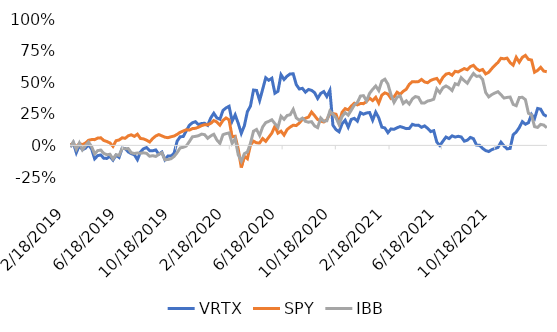
| Category | VRTX | SPY | IBB |
|---|---|---|---|
| 2/18/19 | -0.012 | 0.006 | -0.012 |
| 2/25/19 | 0.022 | 0.011 | 0.027 |
| 3/4/19 | -0.057 | -0.01 | -0.031 |
| 3/11/19 | 0 | 0.014 | 0.019 |
| 3/18/19 | -0.035 | 0.007 | -0.035 |
| 3/25/19 | -0.022 | 0.018 | -0.002 |
| 4/1/19 | 0.004 | 0.04 | 0.026 |
| 4/8/19 | -0.028 | 0.046 | -0.009 |
| 4/15/19 | -0.106 | 0.046 | -0.067 |
| 4/22/19 | -0.081 | 0.058 | -0.041 |
| 4/29/19 | -0.076 | 0.06 | -0.037 |
| 5/6/19 | -0.102 | 0.039 | -0.063 |
| 5/13/19 | -0.103 | 0.031 | -0.074 |
| 5/20/19 | -0.087 | 0.02 | -0.07 |
| 5/27/19 | -0.116 | -0.008 | -0.108 |
| 6/3/19 | -0.077 | 0.037 | -0.073 |
| 6/10/19 | -0.095 | 0.043 | -0.08 |
| 6/17/19 | -0.022 | 0.06 | -0.023 |
| 6/24/19 | -0.025 | 0.056 | -0.026 |
| 7/1/19 | -0.052 | 0.076 | -0.025 |
| 7/8/19 | -0.065 | 0.084 | -0.058 |
| 7/15/19 | -0.074 | 0.071 | -0.064 |
| 7/22/19 | -0.113 | 0.089 | -0.06 |
| 7/29/19 | -0.051 | 0.055 | -0.062 |
| 8/5/19 | -0.027 | 0.051 | -0.059 |
| 8/12/19 | -0.017 | 0.041 | -0.063 |
| 8/19/19 | -0.042 | 0.027 | -0.086 |
| 8/26/19 | -0.043 | 0.054 | -0.081 |
| 9/2/19 | -0.036 | 0.075 | -0.087 |
| 9/9/19 | -0.07 | 0.086 | -0.07 |
| 9/16/19 | -0.053 | 0.075 | -0.058 |
| 9/23/19 | -0.113 | 0.065 | -0.114 |
| 9/30/19 | -0.083 | 0.061 | -0.112 |
| 10/7/19 | -0.083 | 0.068 | -0.105 |
| 10/14/19 | -0.063 | 0.074 | -0.087 |
| 10/21/19 | 0.034 | 0.087 | -0.058 |
| 10/28/19 | 0.068 | 0.104 | -0.02 |
| 11/4/19 | 0.07 | 0.114 | -0.015 |
| 11/11/19 | 0.116 | 0.124 | -0.005 |
| 11/18/19 | 0.159 | 0.121 | 0.03 |
| 11/25/19 | 0.179 | 0.133 | 0.068 |
| 12/2/19 | 0.187 | 0.135 | 0.071 |
| 12/9/19 | 0.164 | 0.144 | 0.077 |
| 12/16/19 | 0.173 | 0.156 | 0.089 |
| 12/23/19 | 0.175 | 0.164 | 0.085 |
| 12/30/19 | 0.159 | 0.162 | 0.056 |
| 1/6/20 | 0.217 | 0.174 | 0.075 |
| 1/13/20 | 0.254 | 0.197 | 0.088 |
| 1/20/20 | 0.218 | 0.185 | 0.043 |
| 1/27/20 | 0.207 | 0.16 | 0.016 |
| 2/3/20 | 0.276 | 0.198 | 0.085 |
| 2/10/20 | 0.296 | 0.217 | 0.093 |
| 2/17/20 | 0.31 | 0.202 | 0.099 |
| 2/24/20 | 0.191 | 0.068 | 0.016 |
| 3/2/20 | 0.242 | 0.072 | 0.053 |
| 3/9/20 | 0.174 | -0.029 | -0.075 |
| 3/16/20 | 0.095 | -0.175 | -0.125 |
| 3/23/20 | 0.155 | -0.086 | -0.065 |
| 3/30/20 | 0.267 | -0.105 | -0.052 |
| 4/6/20 | 0.311 | 0.003 | 0.017 |
| 4/13/20 | 0.438 | 0.033 | 0.112 |
| 4/20/20 | 0.435 | 0.02 | 0.126 |
| 4/27/20 | 0.355 | 0.02 | 0.079 |
| 5/4/20 | 0.444 | 0.054 | 0.146 |
| 5/11/20 | 0.535 | 0.032 | 0.18 |
| 5/18/20 | 0.515 | 0.065 | 0.19 |
| 5/25/20 | 0.531 | 0.097 | 0.203 |
| 6/1/20 | 0.413 | 0.151 | 0.172 |
| 6/8/20 | 0.428 | 0.097 | 0.143 |
| 6/15/20 | 0.559 | 0.113 | 0.23 |
| 6/22/20 | 0.521 | 0.082 | 0.206 |
| 6/29/20 | 0.548 | 0.126 | 0.237 |
| 7/6/20 | 0.566 | 0.145 | 0.243 |
| 7/13/20 | 0.566 | 0.16 | 0.285 |
| 7/20/20 | 0.481 | 0.157 | 0.218 |
| 7/27/20 | 0.446 | 0.177 | 0.199 |
| 8/3/20 | 0.452 | 0.206 | 0.216 |
| 8/10/20 | 0.421 | 0.214 | 0.19 |
| 8/17/20 | 0.442 | 0.224 | 0.184 |
| 8/24/20 | 0.435 | 0.264 | 0.188 |
| 8/31/20 | 0.417 | 0.235 | 0.154 |
| 9/7/20 | 0.372 | 0.204 | 0.141 |
| 9/14/20 | 0.411 | 0.192 | 0.217 |
| 9/21/20 | 0.426 | 0.185 | 0.191 |
| 9/28/20 | 0.387 | 0.204 | 0.195 |
| 10/5/20 | 0.435 | 0.25 | 0.272 |
| 10/12/20 | 0.16 | 0.252 | 0.247 |
| 10/19/20 | 0.125 | 0.247 | 0.218 |
| 10/26/20 | 0.108 | 0.177 | 0.166 |
| 11/2/20 | 0.171 | 0.262 | 0.229 |
| 11/9/20 | 0.199 | 0.291 | 0.259 |
| 11/16/20 | 0.144 | 0.281 | 0.239 |
| 11/23/20 | 0.205 | 0.311 | 0.278 |
| 11/30/20 | 0.214 | 0.333 | 0.319 |
| 12/7/20 | 0.192 | 0.321 | 0.341 |
| 12/14/20 | 0.259 | 0.331 | 0.39 |
| 12/21/20 | 0.247 | 0.33 | 0.393 |
| 12/28/20 | 0.257 | 0.348 | 0.352 |
| 1/4/21 | 0.26 | 0.375 | 0.412 |
| 1/11/21 | 0.199 | 0.355 | 0.443 |
| 1/18/21 | 0.263 | 0.38 | 0.47 |
| 1/25/21 | 0.218 | 0.334 | 0.434 |
| 2/1/21 | 0.145 | 0.398 | 0.509 |
| 2/8/21 | 0.138 | 0.416 | 0.524 |
| 2/15/21 | 0.101 | 0.406 | 0.484 |
| 2/22/21 | 0.13 | 0.371 | 0.401 |
| 3/1/21 | 0.127 | 0.383 | 0.34 |
| 3/8/21 | 0.14 | 0.421 | 0.381 |
| 3/15/21 | 0.149 | 0.404 | 0.391 |
| 3/22/21 | 0.141 | 0.428 | 0.331 |
| 3/29/21 | 0.133 | 0.444 | 0.352 |
| 4/5/21 | 0.134 | 0.484 | 0.327 |
| 4/12/21 | 0.167 | 0.504 | 0.368 |
| 4/19/21 | 0.159 | 0.502 | 0.386 |
| 4/26/21 | 0.16 | 0.504 | 0.38 |
| 5/3/21 | 0.143 | 0.522 | 0.336 |
| 5/10/21 | 0.154 | 0.502 | 0.336 |
| 5/17/21 | 0.135 | 0.496 | 0.351 |
| 5/24/21 | 0.109 | 0.514 | 0.356 |
| 5/31/21 | 0.116 | 0.524 | 0.366 |
| 6/7/21 | 0.026 | 0.53 | 0.447 |
| 6/14/21 | -0.001 | 0.496 | 0.417 |
| 6/21/21 | 0.033 | 0.538 | 0.456 |
| 6/28/21 | 0.066 | 0.564 | 0.47 |
| 7/5/21 | 0.054 | 0.57 | 0.456 |
| 7/12/21 | 0.076 | 0.555 | 0.434 |
| 7/19/21 | 0.066 | 0.586 | 0.488 |
| 7/26/21 | 0.072 | 0.581 | 0.48 |
| 8/2/21 | 0.067 | 0.595 | 0.536 |
| 8/9/21 | 0.033 | 0.608 | 0.512 |
| 8/16/21 | 0.041 | 0.598 | 0.492 |
| 8/23/21 | 0.063 | 0.623 | 0.533 |
| 8/30/21 | 0.053 | 0.633 | 0.569 |
| 9/6/21 | 0.003 | 0.606 | 0.546 |
| 9/13/21 | 0.001 | 0.591 | 0.55 |
| 9/20/21 | -0.024 | 0.6 | 0.522 |
| 9/27/21 | -0.041 | 0.566 | 0.419 |
| 10/4/21 | -0.049 | 0.579 | 0.384 |
| 10/11/21 | -0.033 | 0.607 | 0.402 |
| 10/18/21 | -0.024 | 0.634 | 0.414 |
| 10/25/21 | -0.017 | 0.656 | 0.424 |
| 11/1/21 | 0.025 | 0.689 | 0.401 |
| 11/8/21 | -0.004 | 0.685 | 0.375 |
| 11/15/21 | -0.028 | 0.69 | 0.38 |
| 11/22/21 | -0.024 | 0.655 | 0.383 |
| 11/29/21 | 0.084 | 0.635 | 0.324 |
| 12/6/21 | 0.106 | 0.697 | 0.314 |
| 12/13/21 | 0.141 | 0.658 | 0.379 |
| 12/20/21 | 0.188 | 0.697 | 0.381 |
| 12/27/21 | 0.168 | 0.712 | 0.362 |
| 1/3/22 | 0.18 | 0.68 | 0.254 |
| 1/10/22 | 0.245 | 0.675 | 0.24 |
| 1/17/22 | 0.213 | 0.579 | 0.149 |
| 1/24/22 | 0.292 | 0.593 | 0.142 |
| 1/31/22 | 0.287 | 0.618 | 0.166 |
| 2/7/22 | 0.244 | 0.588 | 0.161 |
| 2/14/22 | 0.229 | 0.583 | 0.14 |